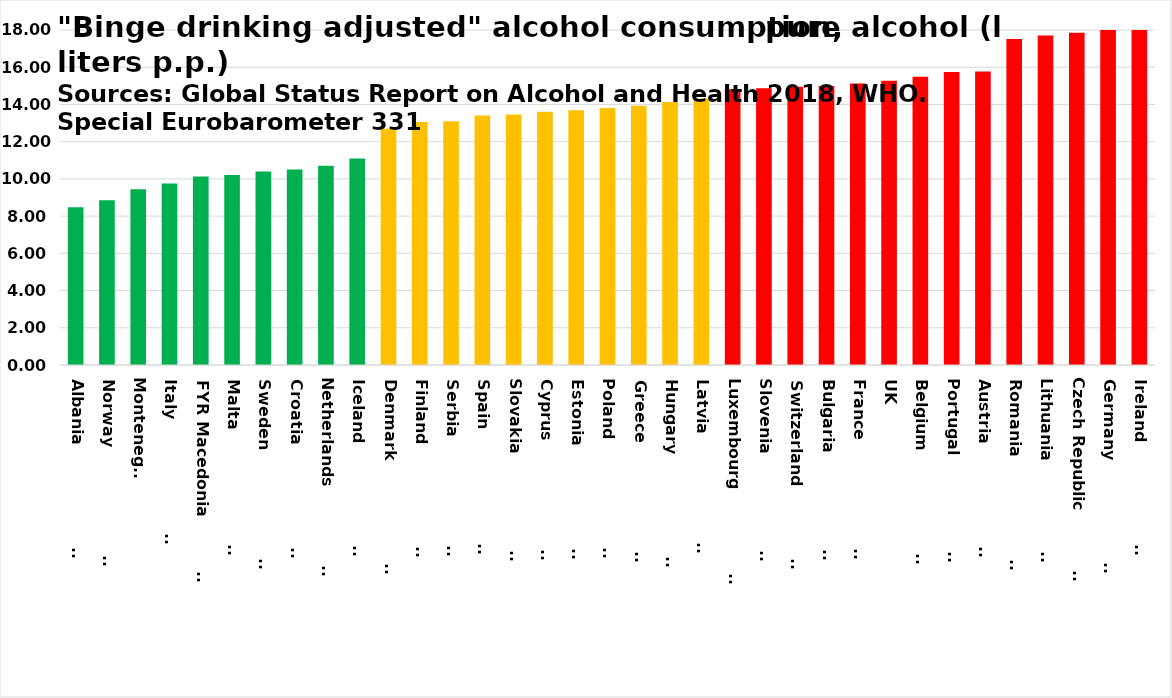
| Category | Series 0 |
|---|---|
| Albania                       | 8.475 |
| Norway                        | 8.85 |
| Montenegro | 9.44 |
| Italy                         | 9.75 |
| FYR Macedonia                | 10.125 |
| Malta                         | 10.206 |
| Sweden                        | 10.396 |
| Croatia                       | 10.502 |
| Netherlands                   | 10.701 |
| Iceland                       | 11.102 |
| Denmark                       | 12.688 |
| Finland                       | 13.054 |
| Serbia                        | 13.098 |
| Spain                         | 13.4 |
| Slovakia                      | 13.455 |
| Cyprus                        | 13.608 |
| Estonia                       | 13.688 |
| Poland                        | 13.804 |
| Greece                        | 13.936 |
| Hungary                       | 14.136 |
| Latvia                        | 14.319 |
| Luxembourg                    | 14.82 |
| Slovenia                      | 14.868 |
| Switzerland                   | 14.95 |
| Bulgaria                      | 14.986 |
| France                        | 15.12 |
| UK | 15.276 |
| Belgium                       | 15.488 |
| Portugal                      | 15.744 |
| Austria                       | 15.776 |
| Romania                       | 17.514 |
| Lithuania                     | 17.7 |
| Czech Republic                | 17.856 |
| Germany                       | 18.224 |
| Ireland                       | 18.72 |